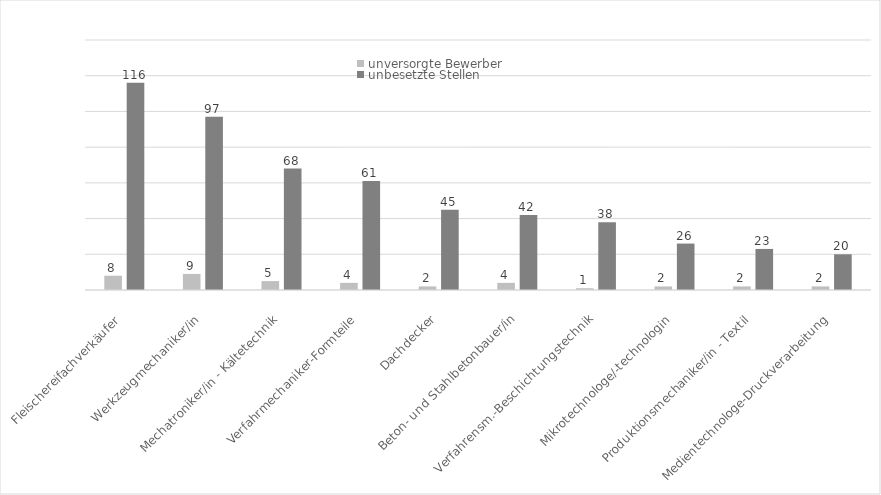
| Category | unversorgte Bewerber | unbesetzte Stellen |
|---|---|---|
| Fleischereifachverkäufer | 8 | 116 |
| Werkzeugmechaniker/in | 9 | 97 |
| Mechatroniker/in - Kältetechnik | 5 | 68 |
| Verfahrmechaniker-Formteile | 4 | 61 |
| Dachdecker | 2 | 45 |
| Beton- und Stahlbetonbauer/in | 4 | 42 |
| Verfahrensm.-Beschichtungstechnik | 1 | 38 |
| Mikrotechnologe/-technologin | 2 | 26 |
| Produktionsmechaniker/in - Textil | 2 | 23 |
| Medientechnologe-Druckverarbeitung | 2 | 20 |